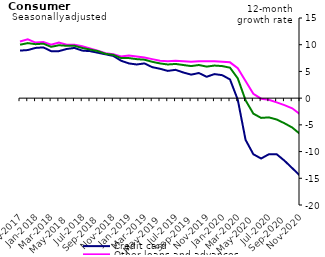
| Category | Credit card | Other loans and advances | Total |
|---|---|---|---|
| Nov-2017 | 8.9 | 10.6 | 10 |
| Dec-2017 | 9 | 11 | 10.3 |
| Jan-2018 | 9.4 | 10.4 | 10.1 |
| Feb-2018 | 9.5 | 10.5 | 10.2 |
| Mar-2018 | 8.8 | 10 | 9.6 |
| Apr-2018 | 8.8 | 10.4 | 9.9 |
| May-2018 | 9.2 | 10 | 9.8 |
| Jun-2018 | 9.4 | 10 | 9.8 |
| Jul-2018 | 8.9 | 9.7 | 9.4 |
| Aug-2018 | 8.8 | 9.3 | 9.1 |
| Sep-2018 | 8.5 | 8.9 | 8.8 |
| Oct-2018 | 8.2 | 8.4 | 8.3 |
| Nov-2018 | 7.9 | 8.2 | 8.1 |
| Dec-2018 | 7 | 7.8 | 7.5 |
| Jan-2019 | 6.5 | 8 | 7.5 |
| Feb-2019 | 6.3 | 7.8 | 7.3 |
| Mar-2019 | 6.5 | 7.6 | 7.2 |
| Apr-2019 | 5.8 | 7.3 | 6.8 |
| May-2019 | 5.5 | 7 | 6.5 |
| Jun-2019 | 5.1 | 6.9 | 6.3 |
| Jul-2019 | 5.3 | 7 | 6.4 |
| Aug-2019 | 4.8 | 6.9 | 6.2 |
| Sep-2019 | 4.4 | 6.8 | 6 |
| Oct-2019 | 4.7 | 6.9 | 6.2 |
| Nov-2019 | 4 | 6.9 | 5.9 |
| Dec-2019 | 4.5 | 6.9 | 6.1 |
| Jan-2020 | 4.3 | 6.8 | 6 |
| Feb-2020 | 3.5 | 6.7 | 5.7 |
| Mar-2020 | -0.3 | 5.6 | 3.7 |
| Apr-2020 | -7.8 | 3.2 | -0.4 |
| May-2020 | -10.5 | 0.8 | -2.9 |
| Jun-2020 | -11.3 | -0.1 | -3.7 |
| Jul-2020 | -10.5 | -0.3 | -3.6 |
| Aug-2020 | -10.5 | -0.8 | -4 |
| Sep-2020 | -11.7 | -1.3 | -4.7 |
| Oct-2020 | -13.1 | -1.9 | -5.5 |
| Nov-2020 | -14.5 | -3 | -6.7 |